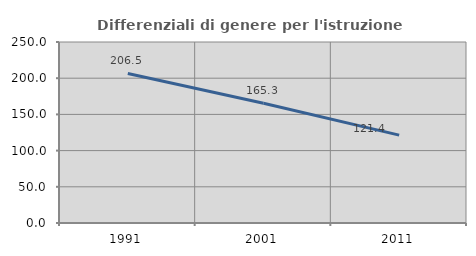
| Category | Differenziali di genere per l'istruzione superiore |
|---|---|
| 1991.0 | 206.492 |
| 2001.0 | 165.333 |
| 2011.0 | 121.372 |